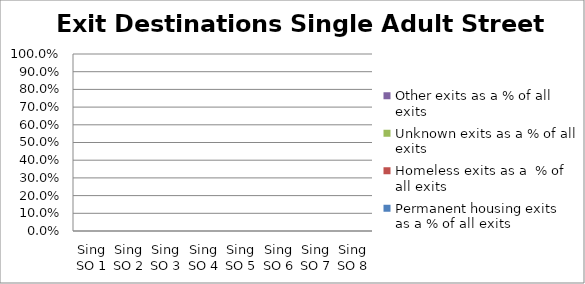
| Category | Permanent housing exits as a % of all exits | Homeless exits as a  % of all exits | Unknown exits as a % of all exits | Other exits as a % of all exits |
|---|---|---|---|---|
| Sing SO 1 | 0 | 0 | 0 | 0 |
| Sing SO 2 | 0 | 0 | 0 | 0 |
| Sing SO 3 | 0 | 0 | 0 | 0 |
| Sing SO 4 | 0 | 0 | 0 | 0 |
| Sing SO 5 | 0 | 0 | 0 | 0 |
| Sing SO 6 | 0 | 0 | 0 | 0 |
| Sing SO 7 | 0 | 0 | 0 | 0 |
| Sing SO 8 | 0 | 0 | 0 | 0 |